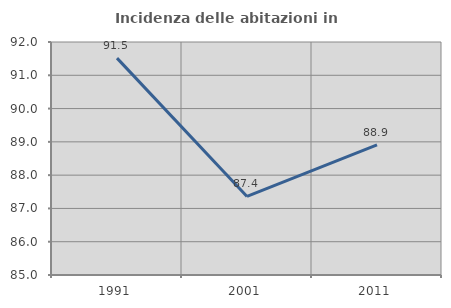
| Category | Incidenza delle abitazioni in proprietà  |
|---|---|
| 1991.0 | 91.515 |
| 2001.0 | 87.36 |
| 2011.0 | 88.912 |